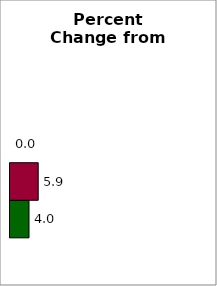
| Category | 50 states and D.C. | SREB states | State |
|---|---|---|---|
| 0 | 4 | 5.937 | 0 |